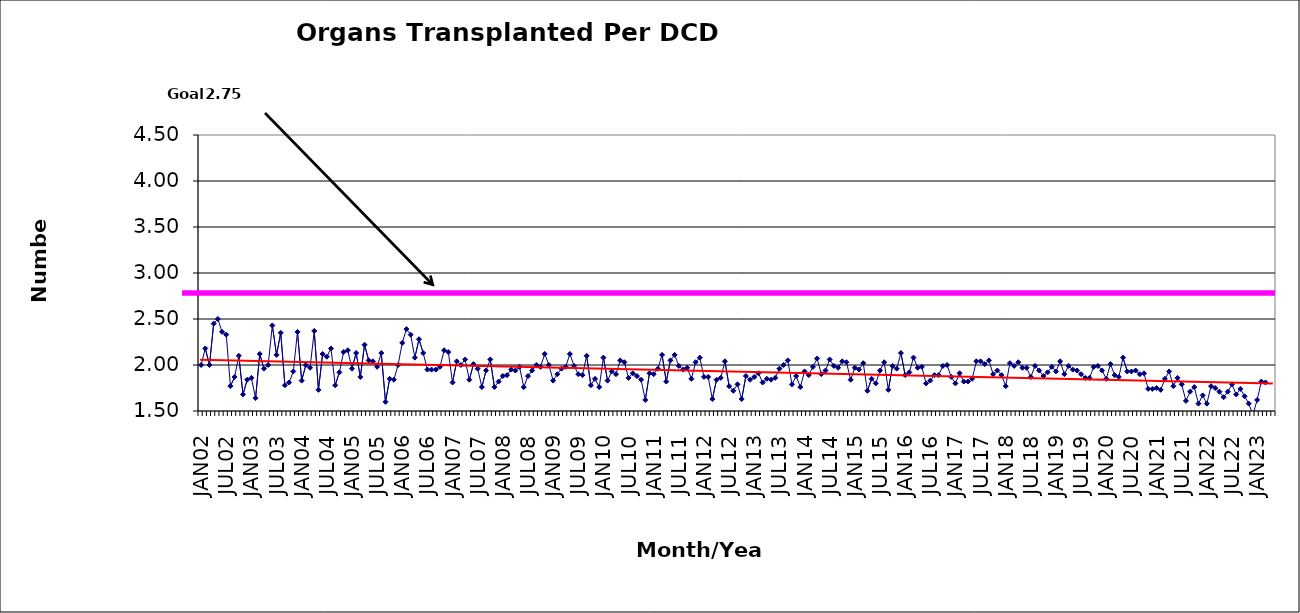
| Category | Series 0 |
|---|---|
| JAN02 | 2 |
| FEB02 | 2.18 |
| MAR02 | 2 |
| APR02 | 2.45 |
| MAY02 | 2.5 |
| JUN02 | 2.36 |
| JUL02 | 2.33 |
| AUG02 | 1.77 |
| SEP02 | 1.87 |
| OCT02 | 2.1 |
| NOV02 | 1.68 |
| DEC02 | 1.84 |
| JAN03 | 1.86 |
| FEB03 | 1.64 |
| MAR03 | 2.12 |
| APR03 | 1.96 |
| MAY03 | 2 |
| JUN03 | 2.43 |
| JUL03 | 2.11 |
| AUG03 | 2.35 |
| SEP03 | 1.78 |
| OCT03 | 1.81 |
| NOV03 | 1.93 |
| DEC03 | 2.36 |
| JAN04 | 1.83 |
| FEB04 | 2 |
| MAR04 | 1.97 |
| APR04 | 2.37 |
| MAY04 | 1.73 |
| JUN04 | 2.12 |
| JUL04 | 2.09 |
| AUG04 | 2.18 |
| SEP04 | 1.78 |
| OCT04 | 1.92 |
| NOV04 | 2.14 |
| DEC04 | 2.16 |
| JAN05 | 1.96 |
| FEB05 | 2.13 |
| MAR05 | 1.87 |
| APR05 | 2.22 |
| MAY05 | 2.05 |
| JUN05 | 2.04 |
| JUL05 | 1.98 |
| AUG05 | 2.13 |
| SEP05 | 1.6 |
| OCT05 | 1.85 |
| NOV05 | 1.84 |
| DEC05 | 2 |
| JAN06 | 2.24 |
| FEB06 | 2.39 |
| MAR06 | 2.33 |
| APR06 | 2.08 |
| MAY06 | 2.28 |
| JUN06 | 2.13 |
| JUL06 | 1.95 |
| AUG06 | 1.95 |
| SEP06 | 1.95 |
| OCT06 | 1.98 |
| NOV06 | 2.16 |
| DEC06 | 2.14 |
| JAN07 | 1.81 |
| FEB07 | 2.04 |
| MAR07 | 2 |
| APR07 | 2.06 |
| MAY07 | 1.84 |
| JUN07 | 2.01 |
| JUL07 | 1.96 |
| AUG07 | 1.76 |
| SEP07 | 1.94 |
| OCT07 | 2.06 |
| NOV07 | 1.76 |
| DEC07 | 1.82 |
| JAN08 | 1.88 |
| FEB08 | 1.89 |
| MAR08 | 1.95 |
| APR08 | 1.94 |
| MAY08 | 1.98 |
| JUN08 | 1.76 |
| JUL08 | 1.88 |
| AUG08 | 1.94 |
| SEP08 | 2 |
| OCT08 | 1.98 |
| NOV08 | 2.12 |
| DEC08 | 2 |
| JAN09 | 1.83 |
| FEB09 | 1.9 |
| MAR09 | 1.96 |
| APR09 | 1.98 |
| MAY09 | 2.12 |
| JUN09 | 1.99 |
| JUL09 | 1.9 |
| AUG09 | 1.89 |
| SEP09 | 2.1 |
| OCT09 | 1.78 |
| NOV09 | 1.85 |
| DEC09 | 1.76 |
| JAN10 | 2.08 |
| FEB10 | 1.83 |
| MAR10 | 1.93 |
| APR10 | 1.9 |
| MAY10 | 2.05 |
| JUN10 | 2.03 |
| JUL10 | 1.86 |
| AUG10 | 1.91 |
| SEP10 | 1.88 |
| OCT10 | 1.84 |
| NOV10 | 1.62 |
| DEC10 | 1.91 |
| JAN11 | 1.9 |
| FEB11 | 1.96 |
| MAR11 | 2.11 |
| APR11 | 1.82 |
| MAY11 | 2.05 |
| JUN11 | 2.11 |
| JUL11 | 1.99 |
| AUG11 | 1.95 |
| SEP11 | 1.97 |
| OCT11 | 1.85 |
| NOV11 | 2.03 |
| DEC11 | 2.08 |
| JAN12 | 1.87 |
| FEB12 | 1.87 |
| MAR12 | 1.63 |
| APR12 | 1.84 |
| MAY12 | 1.86 |
| JUN12 | 2.04 |
| JUL12 | 1.77 |
| AUG12 | 1.72 |
| SEP12 | 1.79 |
| OCT12 | 1.63 |
| NOV12 | 1.88 |
| DEC12 | 1.84 |
| JAN13 | 1.87 |
| FEB13 | 1.91 |
| MAR13 | 1.81 |
| APR13 | 1.85 |
| MAY13 | 1.84 |
| JUN13 | 1.86 |
| JUL13 | 1.96 |
| AUG13 | 2 |
| SEP13 | 2.05 |
| OCT13 | 1.79 |
| NOV13 | 1.88 |
| DEC13 | 1.76 |
| JAN14 | 1.93 |
| FEB14 | 1.89 |
| MAR14 | 1.98 |
| APR14 | 2.07 |
| MAY14 | 1.9 |
| JUN14 | 1.94 |
| JUL14 | 2.06 |
| AUG14 | 1.99 |
| SEP14 | 1.97 |
| OCT14 | 2.04 |
| NOV14 | 2.03 |
| DEC14 | 1.84 |
| JAN15 | 1.97 |
| FEB15 | 1.95 |
| MAR15 | 2.02 |
| APR15 | 1.72 |
| MAY15 | 1.85 |
| JUN15 | 1.8 |
| JUL15 | 1.94 |
| AUG15 | 2.03 |
| SEP15 | 1.73 |
| OCT15 | 1.99 |
| NOV15 | 1.96 |
| DEC15 | 2.13 |
| JAN16 | 1.89 |
| FEB16 | 1.92 |
| MAR16 | 2.08 |
| APR16 | 1.97 |
| MAY16 | 1.98 |
| JUN16 | 1.8 |
| JUL16 | 1.83 |
| AUG16 | 1.89 |
| SEP16 | 1.89 |
| OCT16 | 1.99 |
| NOV16 | 2 |
| DEC16 | 1.87 |
| JAN17 | 1.8 |
| FEB17 | 1.91 |
| MAR17 | 1.82 |
| APR17 | 1.82 |
| MAY17 | 1.85 |
| JUN17 | 2.04 |
| JUL17 | 2.04 |
| AUG17 | 2.01 |
| SEP17 | 2.05 |
| OCT17 | 1.9 |
| NOV17 | 1.94 |
| DEC17 | 1.89 |
| JAN18 | 1.77 |
| FEB18 | 2.02 |
| MAR18 | 1.99 |
| APR18 | 2.03 |
| MAY18 | 1.97 |
| JUN18 | 1.97 |
| JUL18 | 1.87 |
| AUG18 | 1.99 |
| SEP18 | 1.94 |
| OCT18 | 1.88 |
| NOV18 | 1.92 |
| DEC18 | 1.98 |
| JAN19 | 1.93 |
| FEB19 | 2.04 |
| MAR19 | 1.9 |
| APR19 | 1.99 |
| MAY19 | 1.95 |
| JUN19 | 1.94 |
| JUL19 | 1.9 |
| AUG19 | 1.86 |
| SEP19 | 1.86 |
| OCT19 | 1.98 |
| NOV19 | 1.99 |
| DEC19 | 1.94 |
| JAN20 | 1.85 |
| FEB20 | 2.01 |
| MAR20 | 1.89 |
| APR20 | 1.87 |
| MAY20 | 2.08 |
| JUN20 | 1.93 |
| JUL20 | 1.93 |
| AUG20 | 1.94 |
| SEP20 | 1.9 |
| OCT20 | 1.91 |
| NOV20 | 1.74 |
| DEC20 | 1.74 |
| JAN21 | 1.75 |
| FEB21 | 1.73 |
| MAR21 | 1.85 |
| APR21 | 1.93 |
| MAY21 | 1.77 |
| JUN21 | 1.86 |
| JUL21 | 1.79 |
| AUG21 | 1.61 |
| SEP21 | 1.71 |
| OCT21 | 1.76 |
| NOV21 | 1.58 |
| DEC21 | 1.67 |
| JAN22 | 1.58 |
| FEB22 | 1.77 |
| MAR22 | 1.75 |
| APR22 | 1.71 |
| MAY22 | 1.65 |
| JUN22 | 1.71 |
| JUL22 | 1.79 |
| AUG22 | 1.68 |
| SEP22 | 1.74 |
| OCT22 | 1.66 |
| NOV22 | 1.58 |
| DEC22 | 1.46 |
| JAN23 | 1.62 |
| FEB23 | 1.82 |
| MAR23 | 1.81 |